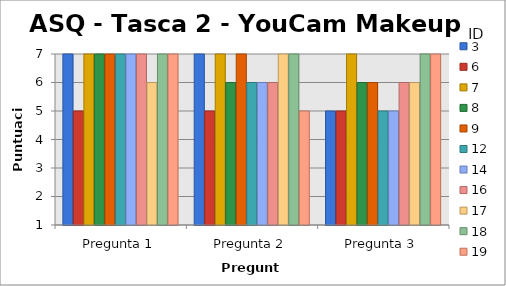
| Category | 3 | 6 | 7 | 8 | 9 | 12 | 14 | 16 | 17 | 18 | 19 |
|---|---|---|---|---|---|---|---|---|---|---|---|
| Pregunta 1 | 7 | 5 | 7 | 7 | 7 | 7 | 7 | 7 | 6 | 7 | 7 |
| Pregunta 2 | 7 | 5 | 7 | 6 | 7 | 6 | 6 | 6 | 7 | 7 | 5 |
| Pregunta 3 | 5 | 5 | 7 | 6 | 6 | 5 | 5 | 6 | 6 | 7 | 7 |